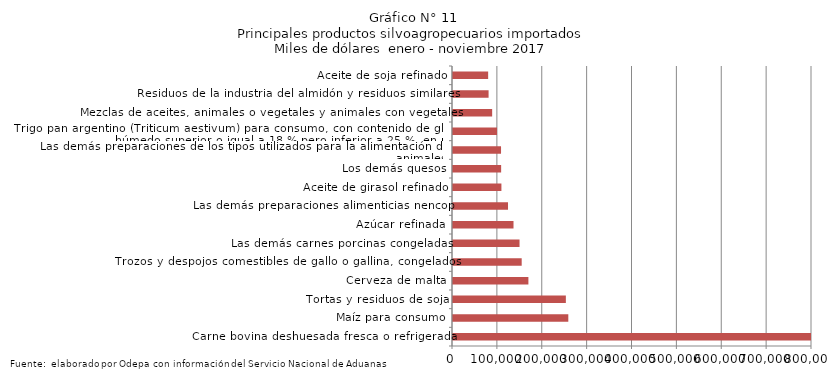
| Category | Series 0 |
|---|---|
| Carne bovina deshuesada fresca o refrigerada | 807057.736 |
| Maíz para consumo | 256948.852 |
| Tortas y residuos de soja | 251496.457 |
| Cerveza de malta | 168011.541 |
| Trozos y despojos comestibles de gallo o gallina, congelados | 153079.431 |
| Las demás carnes porcinas congeladas | 148279.392 |
| Azúcar refinada | 134836.363 |
| Las demás preparaciones alimenticias nencop | 122587.779 |
| Aceite de girasol refinado | 107880.22 |
| Los demás quesos | 107272.17 |
| Las demás preparaciones de los tipos utilizados para la alimentación de los animales | 107056.606 |
| Trigo pan argentino (Triticum aestivum) para consumo, con contenido de gluten húmedo superior o igual a 18 % pero inferior a 25 %, en peso | 98112.122 |
| Mezclas de aceites, animales o vegetales y animales con vegetales | 87256.233 |
| Residuos de la industria del almidón y residuos similares | 79307.684 |
| Aceite de soja refinado | 78339.748 |